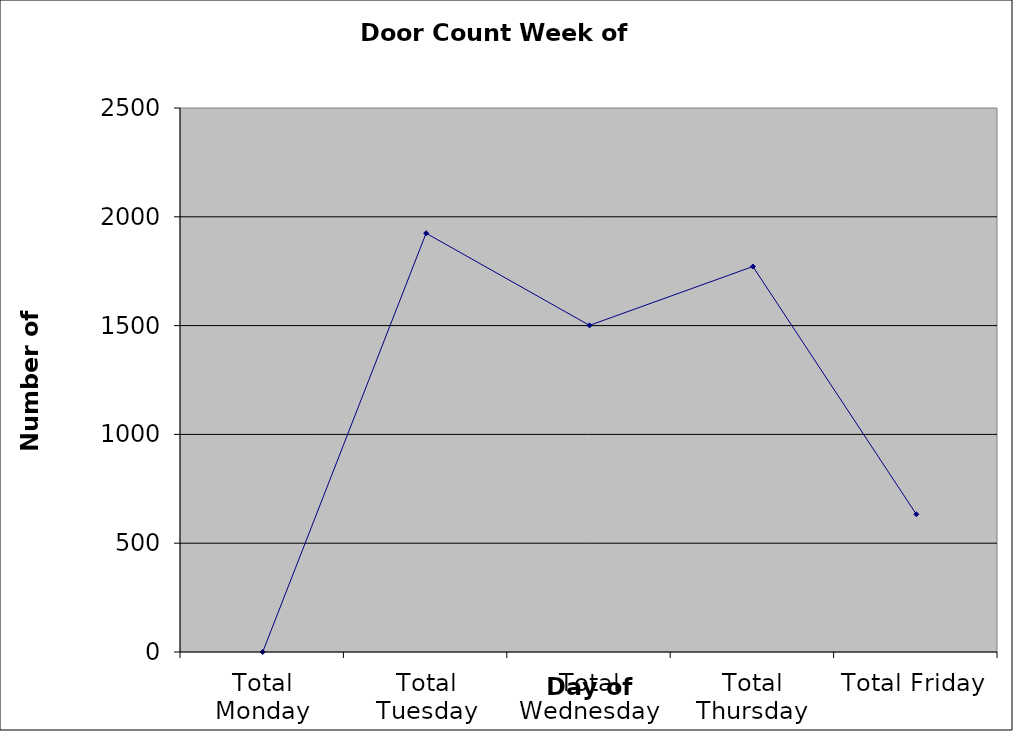
| Category | Series 0 |
|---|---|
| Total Monday | 0 |
| Total Tuesday | 1924.5 |
| Total Wednesday | 1501 |
| Total Thursday | 1771.5 |
| Total Friday | 633 |